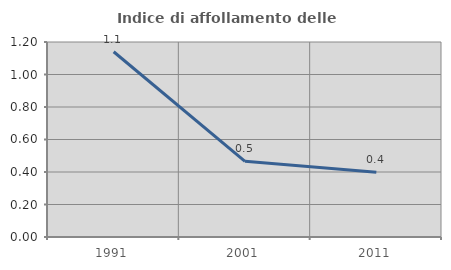
| Category | Indice di affollamento delle abitazioni  |
|---|---|
| 1991.0 | 1.14 |
| 2001.0 | 0.465 |
| 2011.0 | 0.398 |